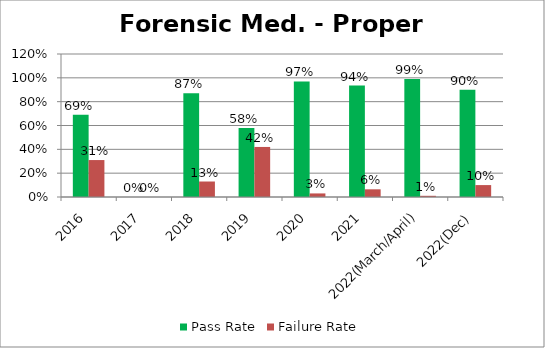
| Category | Pass Rate | Failure Rate |
|---|---|---|
| 2016 | 0.69 | 0.31 |
| 2017 | 0 | 0 |
| 2018 | 0.87 | 0.13 |
| 2019 | 0.58 | 0.42 |
| 2020 | 0.97 | 0.03 |
| 2021 | 0.935 | 0.065 |
| 2022(March/April) | 0.99 | 0.01 |
| 2022(Dec) | 0.9 | 0.1 |